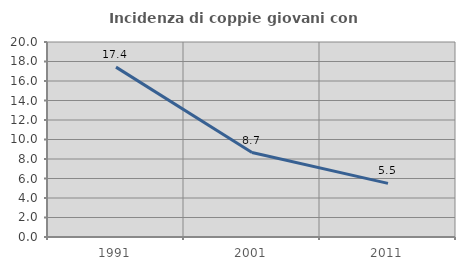
| Category | Incidenza di coppie giovani con figli |
|---|---|
| 1991.0 | 17.422 |
| 2001.0 | 8.659 |
| 2011.0 | 5.497 |